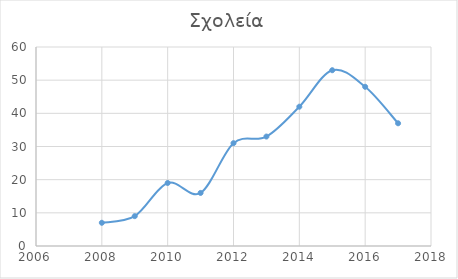
| Category | Series 0 |
|---|---|
| 2008.0 | 7 |
| 2009.0 | 9 |
| 2010.0 | 19 |
| 2011.0 | 16 |
| 2012.0 | 31 |
| 2013.0 | 33 |
| 2014.0 | 42 |
| 2015.0 | 53 |
| 2016.0 | 48 |
| 2017.0 | 37 |